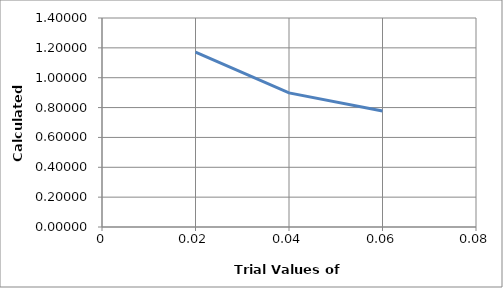
| Category | Series 0 |
|---|---|
| 0.02 | 1.171 |
| 0.04 | 0.898 |
| 0.06 | 0.777 |